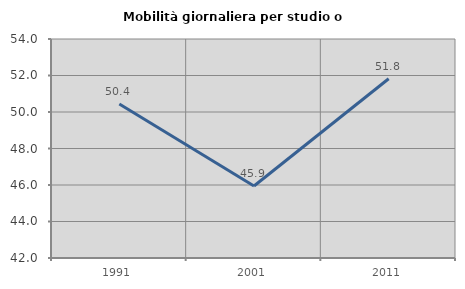
| Category | Mobilità giornaliera per studio o lavoro |
|---|---|
| 1991.0 | 50.441 |
| 2001.0 | 45.943 |
| 2011.0 | 51.82 |